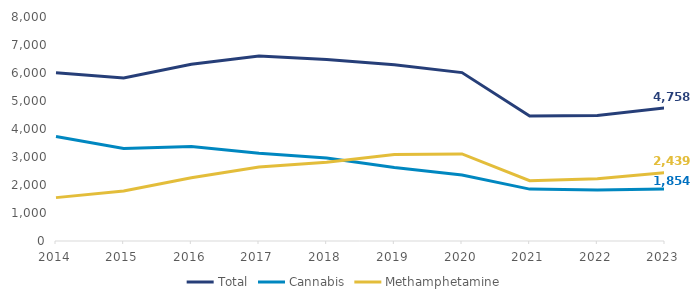
| Category | Total | Cannabis | Methamphetamine |
|---|---|---|---|
| 2014.0 | 6009 | 3729 | 1549 |
| 2015.0 | 5819 | 3300 | 1788 |
| 2016.0 | 6312 | 3373 | 2256 |
| 2017.0 | 6608 | 3132 | 2642 |
| 2018.0 | 6480 | 2962 | 2815 |
| 2019.0 | 6294 | 2624 | 3089 |
| 2020.0 | 6014 | 2358 | 3110 |
| 2021.0 | 4463 | 1853 | 2152 |
| 2022.0 | 4479 | 1820 | 2222 |
| 2023.0 | 4758 | 1854 | 2439 |